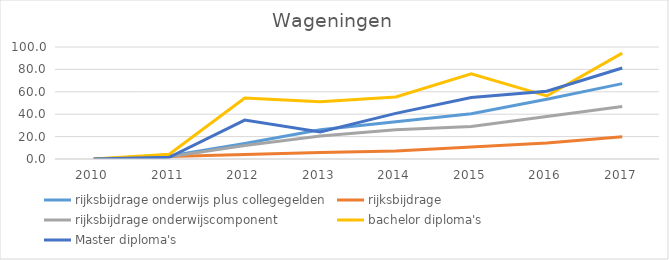
| Category | rijksbijdrage onderwijs plus collegegelden | rijksbijdrage  | rijksbijdrage onderwijscomponent | bachelor diploma's | Master diploma's |
|---|---|---|---|---|---|
| 2010.0 | 0 | 0 | 0 | 0 | 0 |
| 2011.0 | 2.754 | 2.215 | 1.921 | 4.263 | 1.469 |
| 2012.0 | 13.885 | 4.052 | 12.137 | 54.352 | 34.77 |
| 2013.0 | 26.145 | 5.801 | 20.476 | 51.155 | 24.192 |
| 2014.0 | 33.218 | 7.157 | 26.088 | 55.417 | 40.744 |
| 2015.0 | 40.362 | 10.809 | 29.01 | 76.021 | 54.946 |
| 2016.0 | 53.392 | 14.331 | 37.989 | 56.306 | 60.529 |
| 2017.0 | 67.283 | 19.806 | 46.887 | 94.494 | 81.293 |